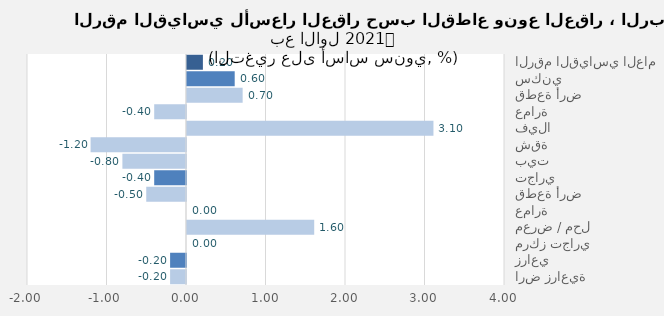
| Category | Series 0 |
|---|---|
| الرقم القياسي العام | 0.2 |
| سكني | 0.6 |
| قطعة أرض | 0.7 |
| عمارة | -0.4 |
| فيلا | 3.1 |
| شقة | -1.2 |
| بيت | -0.8 |
| تجاري | -0.4 |
| قطعة أرض | -0.5 |
| عمارة | 0 |
| معرض / محل | 1.6 |
| مركز تجاري | 0 |
| زراعي | -0.2 |
| ارض زراعية | -0.2 |